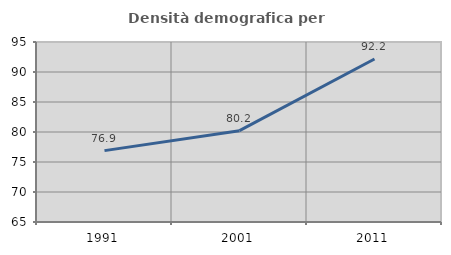
| Category | Densità demografica |
|---|---|
| 1991.0 | 76.893 |
| 2001.0 | 80.221 |
| 2011.0 | 92.16 |